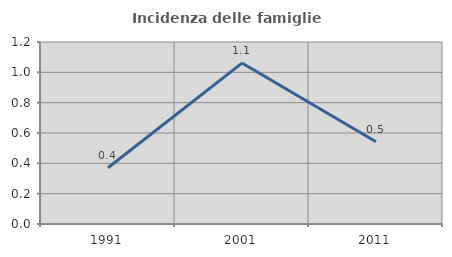
| Category | Incidenza delle famiglie numerose |
|---|---|
| 1991.0 | 0.371 |
| 2001.0 | 1.061 |
| 2011.0 | 0.543 |